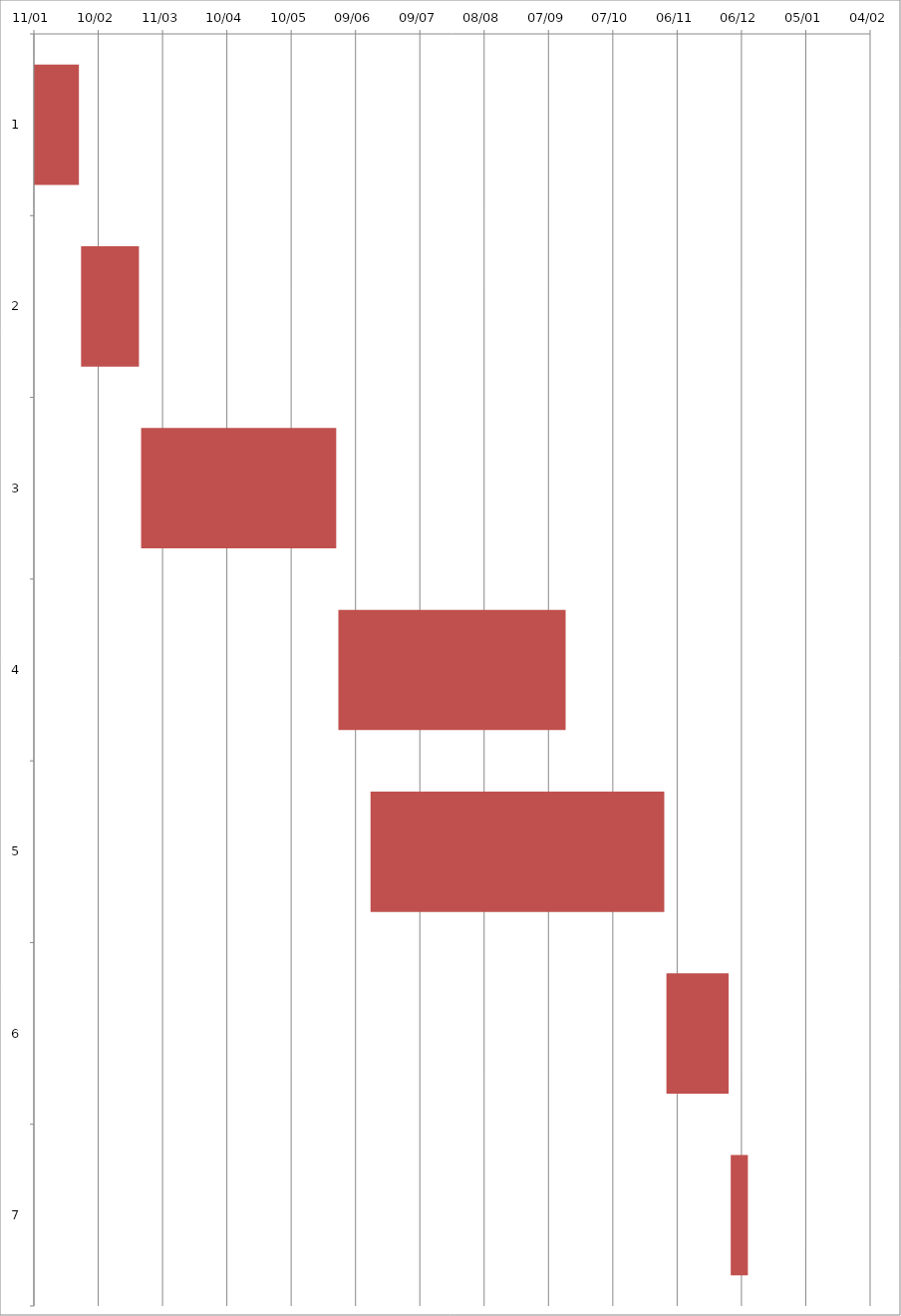
| Category | Fecha de inicio | DURACIÓN |
|---|---|---|
| 0 | 1/11/16 | 21 |
| 1 | 2/2/16 | 27 |
| 2 | 3/1/16 | 91 |
| 3 | 6/1/16 | 106 |
| 4 | 6/16/16 | 137 |
| 5 | 11/1/16 | 29 |
| 6 | 12/1/16 | 8 |